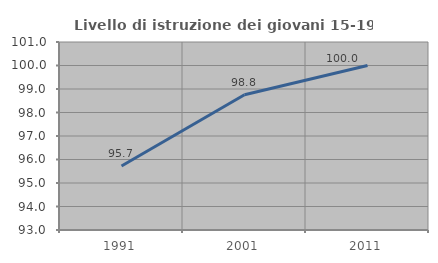
| Category | Livello di istruzione dei giovani 15-19 anni |
|---|---|
| 1991.0 | 95.724 |
| 2001.0 | 98.754 |
| 2011.0 | 100 |